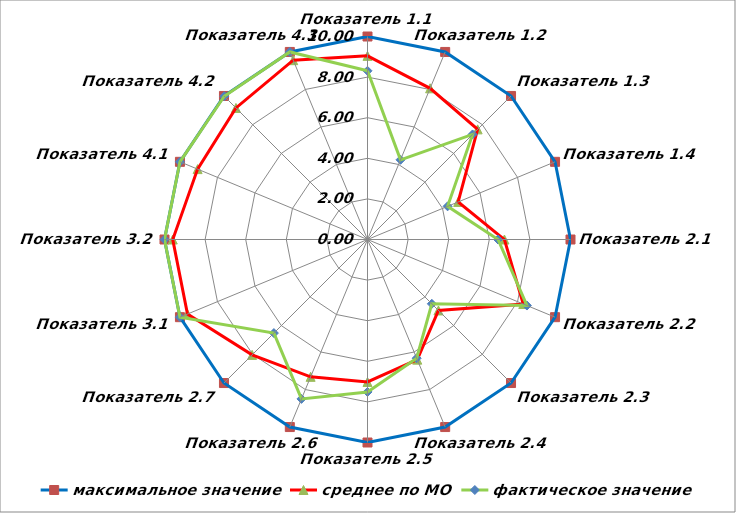
| Category | максимальное значение | среднее по МО | фактическое значение |
|---|---|---|---|
| Показатель 1.1 | 10 | 9.046 | 8.31 |
| Показатель 1.2 | 10 | 8.061 | 4.25 |
| Показатель 1.3 | 10 | 7.673 | 7.32 |
| Показатель 1.4 | 10 | 4.833 | 4.27 |
| Показатель 2.1 | 10 | 6.745 | 6.43 |
| Показатель 2.2 | 10 | 8.305 | 8.5 |
| Показатель 2.3 | 10 | 4.943 | 4.48 |
| Показатель 2.4 | 10 | 6.405 | 6.33 |
| Показатель 2.5 | 10 | 7.017 | 7.51 |
| Показатель 2.6 | 10 | 7.323 | 8.5 |
| Показатель 2.7 | 10 | 8.039 | 6.52 |
| Показатель 3.1 | 10 | 9.599 | 10 |
| Показатель 3.2 | 10 | 9.593 | 10 |
| Показатель 4.1 | 10 | 9.059 | 10 |
| Показатель 4.2 | 10 | 9.164 | 9.98 |
| Показатель 4.3 | 10 | 9.561 | 10 |